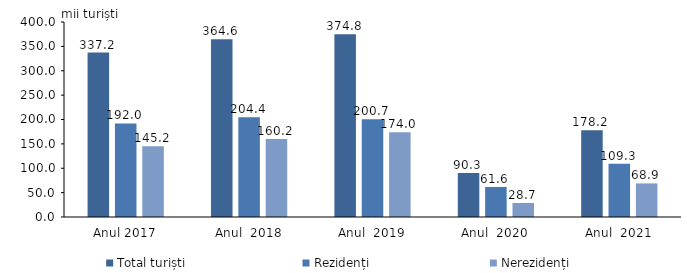
| Category | Total turiști | Rezidenți  | Nerezidenți  |
|---|---|---|---|
| Anul 2017 | 337.2 | 192 | 145.2 |
| Anul  2018 | 364.6 | 204.4 | 160.2 |
| Anul  2019 | 374.76 | 200.74 | 174.02 |
| Anul  2020 | 90.3 | 61.6 | 28.7 |
| Anul  2021 | 178.2 | 109.3 | 68.9 |